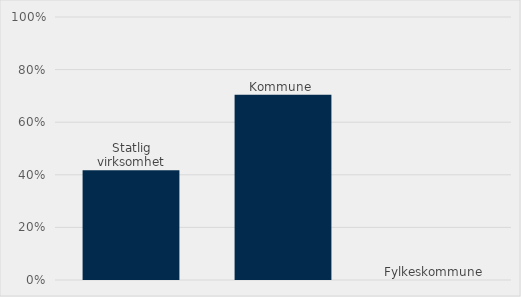
| Category | Estimert verdi som har miljømerke som tildelingskriterium (%) |
|---|---|
| Statlig virksomhet | 0.417 |
| Kommune  | 0.704 |
| Fylkeskommune | 0 |